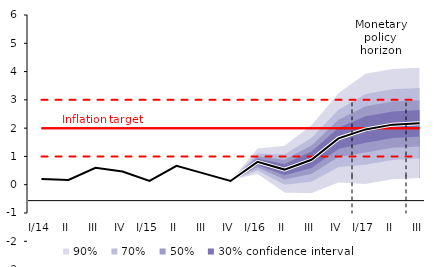
| Category | Inflation Target | Inflation Target - lower bound | Inflation Target - upper bound | linka | Střed předpovědi |
|---|---|---|---|---|---|
| I/14 | 2 | 1 | 3 | 0.2 | 0.2 |
| II | 2 | 1 | 3 | 0.167 | 0.167 |
| III | 2 | 1 | 3 | 0.6 | 0.6 |
| IV | 2 | 1 | 3 | 0.467 | 0.467 |
| I/15 | 2 | 1 | 3 | 0.133 | 0.133 |
| II | 2 | 1 | 3 | 0.667 | 0.667 |
| III | 2 | 1 | 3 | 0.4 | 0.4 |
| IV | 2 | 1 | 3 | 0.133 | 0.133 |
| I/16 | 2 | 1 | 3 | 0.809 | 0.809 |
| II | 2 | 1 | 3 | 0.535 | 0.535 |
| III | 2 | 1 | 3 | 0.881 | 0.881 |
| IV | 2 | 1 | 3 | 1.638 | 1.638 |
| I/17 | 2 | 1 | 3 | 1.956 | 1.956 |
| II | 2 | 1 | 3 | 2.124 | 2.124 |
| III | 2 | 1 | 3 | 2.171 | 2.171 |